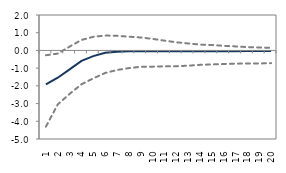
| Category | lower bound | median | upper bound |
|---|---|---|---|
| 1.0 | -4.303 | -1.916 | -0.272 |
| 2.0 | -3.045 | -1.542 | -0.179 |
| 3.0 | -2.454 | -1.072 | 0.217 |
| 4.0 | -1.912 | -0.593 | 0.592 |
| 5.0 | -1.577 | -0.319 | 0.769 |
| 6.0 | -1.271 | -0.136 | 0.84 |
| 7.0 | -1.105 | -0.071 | 0.827 |
| 8.0 | -0.999 | -0.041 | 0.776 |
| 9.0 | -0.923 | -0.039 | 0.73 |
| 10.0 | -0.916 | -0.041 | 0.652 |
| 11.0 | -0.895 | -0.04 | 0.554 |
| 12.0 | -0.895 | -0.045 | 0.459 |
| 13.0 | -0.861 | -0.048 | 0.394 |
| 14.0 | -0.814 | -0.044 | 0.33 |
| 15.0 | -0.792 | -0.044 | 0.308 |
| 16.0 | -0.766 | -0.041 | 0.26 |
| 17.0 | -0.748 | -0.041 | 0.226 |
| 18.0 | -0.738 | -0.037 | 0.188 |
| 19.0 | -0.738 | -0.036 | 0.164 |
| 20.0 | -0.716 | -0.033 | 0.149 |